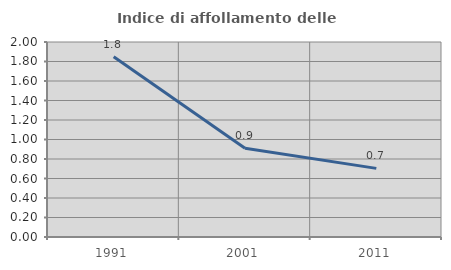
| Category | Indice di affollamento delle abitazioni  |
|---|---|
| 1991.0 | 1.849 |
| 2001.0 | 0.911 |
| 2011.0 | 0.704 |